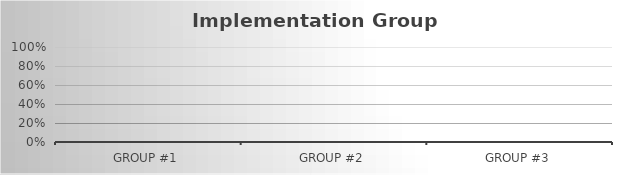
| Category | Series 0 |
|---|---|
| Group #1 | 0 |
| Group #2 | 0 |
| Group #3 | 0 |